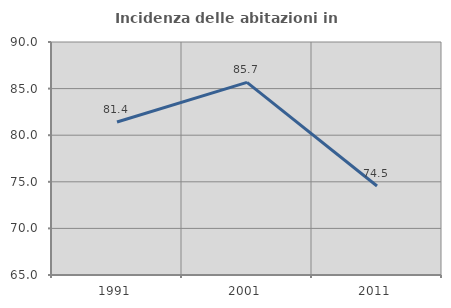
| Category | Incidenza delle abitazioni in proprietà  |
|---|---|
| 1991.0 | 81.41 |
| 2001.0 | 85.664 |
| 2011.0 | 74.545 |